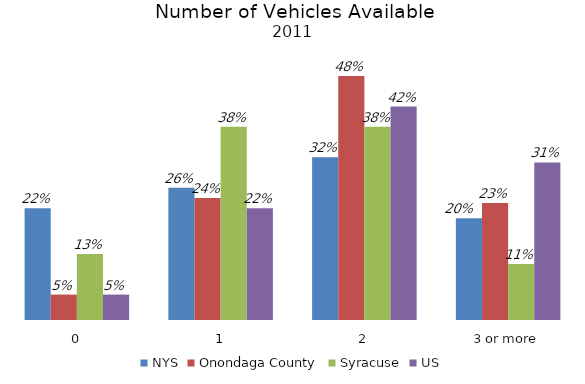
| Category | NYS | Onondaga County | Syracuse | US |
|---|---|---|---|---|
| 0 | 0.22 | 0.05 | 0.13 | 0.05 |
| 1 | 0.26 | 0.24 | 0.38 | 0.22 |
| 2 | 0.32 | 0.48 | 0.38 | 0.42 |
| 3 or more | 0.2 | 0.23 | 0.11 | 0.31 |